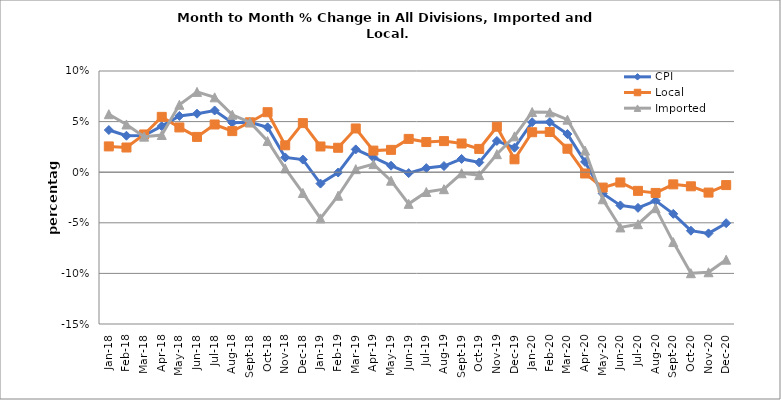
| Category | CPI | Local | Imported |
|---|---|---|---|
| 2018-01-01 | 0.042 | 0.025 | 0.057 |
| 2018-02-01 | 0.036 | 0.024 | 0.047 |
| 2018-03-01 | 0.036 | 0.037 | 0.035 |
| 2018-04-01 | 0.045 | 0.055 | 0.037 |
| 2018-05-01 | 0.056 | 0.044 | 0.067 |
| 2018-06-01 | 0.058 | 0.035 | 0.079 |
| 2018-07-01 | 0.061 | 0.047 | 0.074 |
| 2018-08-01 | 0.049 | 0.041 | 0.057 |
| 2018-09-01 | 0.049 | 0.049 | 0.049 |
| 2018-10-01 | 0.044 | 0.059 | 0.031 |
| 2018-11-01 | 0.015 | 0.027 | 0.004 |
| 2018-12-01 | 0.012 | 0.049 | -0.021 |
| 2019-01-01 | -0.011 | 0.025 | -0.046 |
| 2019-02-01 | 0 | 0.024 | -0.023 |
| 2019-03-01 | 0.023 | 0.043 | 0.003 |
| 2019-04-01 | 0.015 | 0.021 | 0.008 |
| 2019-05-01 | 0.006 | 0.022 | -0.008 |
| 2019-06-01 | -0.001 | 0.033 | -0.031 |
| 2019-07-01 | 0.004 | 0.03 | -0.02 |
| 2019-08-01 | 0.006 | 0.031 | -0.017 |
| 2019-09-01 | 0.013 | 0.028 | -0.001 |
| 2019-10-01 | 0.01 | 0.023 | -0.003 |
| 2019-11-01 | 0.031 | 0.045 | 0.018 |
| 2019-12-01 | 0.024 | 0.013 | 0.035 |
| 2020-01-01 | 0.049 | 0.039 | 0.059 |
| 2020-02-01 | 0.05 | 0.04 | 0.059 |
| 2020-03-01 | 0.038 | 0.023 | 0.052 |
| 2020-04-01 | 0.01 | -0.001 | 0.021 |
| 2020-05-01 | -0.021 | -0.015 | -0.027 |
| 2020-06-01 | -0.033 | -0.01 | -0.055 |
| 2020-07-01 | -0.035 | -0.018 | -0.051 |
| 2020-08-01 | -0.028 | -0.02 | -0.036 |
| 2020-09-01 | -0.041 | -0.012 | -0.069 |
| 2020-10-01 | -0.058 | -0.014 | -0.1 |
| 2020-11-01 | -0.06 | -0.02 | -0.099 |
| 2020-12-01 | -0.05 | -0.013 | -0.086 |